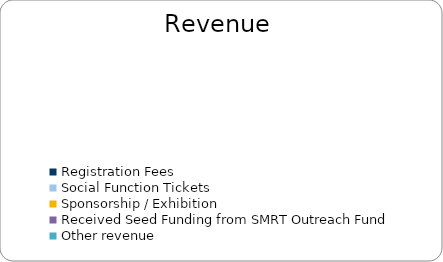
| Category | Series 0 |
|---|---|
| Registration Fees | 0 |
| Social Function Tickets | 0 |
| Sponsorship / Exhibition | 0 |
| Received Seed Funding from SMRT Outreach Fund | 0 |
| Other revenue | 0 |